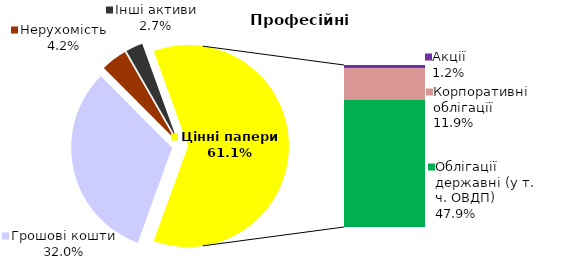
| Category | Професійні |
|---|---|
| Грошові кошти | 53.39 |
| Банківські метали | 0 |
| Нерухомість | 7.006 |
| Інші активи | 4.582 |
| Акції | 1.986 |
| Корпоративні облігації | 19.915 |
| Облігації місцевих рад | 0 |
| Облігації державні (у т. ч. ОВДП) | 80.015 |